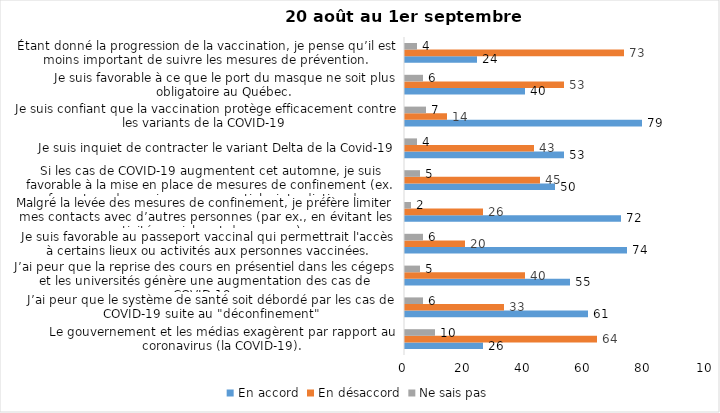
| Category | En accord | En désaccord | Ne sais pas |
|---|---|---|---|
| Le gouvernement et les médias exagèrent par rapport au coronavirus (la COVID-19). | 26 | 64 | 10 |
| J’ai peur que le système de santé soit débordé par les cas de COVID-19 suite au "déconfinement" | 61 | 33 | 6 |
| J’ai peur que la reprise des cours en présentiel dans les cégeps et les universités génère une augmentation des cas de COVID-19. | 55 | 40 | 5 |
| Je suis favorable au passeport vaccinal qui permettrait l'accès à certains lieux ou activités aux personnes vaccinées. | 74 | 20 | 6 |
| Malgré la levée des mesures de confinement, je préfère limiter mes contacts avec d’autres personnes (par ex., en évitant les activités sociales et de groupes) | 72 | 26 | 2 |
| Si les cas de COVID-19 augmentent cet automne, je suis favorable à la mise en place de mesures de confinement (ex. fermeture de services non essentiels, interdiction des rassemblements privés) | 50 | 45 | 5 |
| Je suis inquiet de contracter le variant Delta de la Covid-19 | 53 | 43 | 4 |
| Je suis confiant que la vaccination protège efficacement contre les variants de la COVID-19 | 79 | 14 | 7 |
| Je suis favorable à ce que le port du masque ne soit plus obligatoire au Québec. | 40 | 53 | 6 |
| Étant donné la progression de la vaccination, je pense qu’il est moins important de suivre les mesures de prévention. | 24 | 73 | 4 |